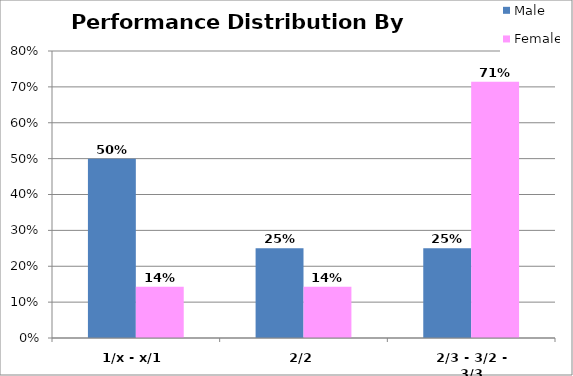
| Category | Male | Female |
|---|---|---|
| 1/x - x/1 | 0.5 | 0.143 |
| 2/2 | 0.25 | 0.143 |
| 2/3 - 3/2 - 3/3 | 0.25 | 0.714 |